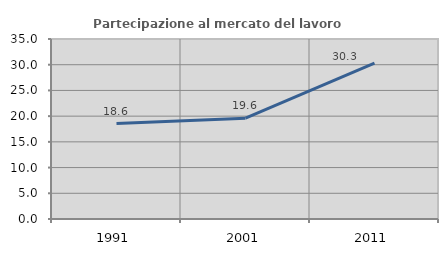
| Category | Partecipazione al mercato del lavoro  femminile |
|---|---|
| 1991.0 | 18.569 |
| 2001.0 | 19.612 |
| 2011.0 | 30.305 |